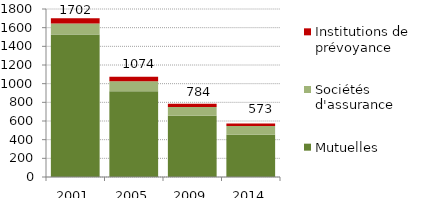
| Category | Mutuelles | Sociétés d'assurance | Institutions de prévoyance |
|---|---|---|---|
| 2001.0 | 1528 | 117 | 57 |
| 2005.0 | 919 | 107 | 48 |
| 2009.0 | 656 | 93 | 35 |
| 2014.0 | 453 | 94 | 26 |